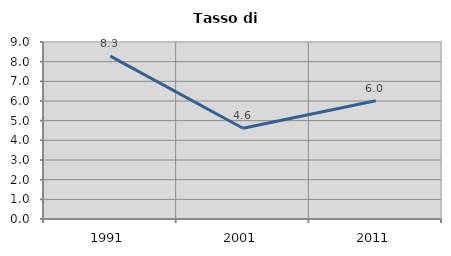
| Category | Tasso di disoccupazione   |
|---|---|
| 1991.0 | 8.285 |
| 2001.0 | 4.614 |
| 2011.0 | 6.017 |